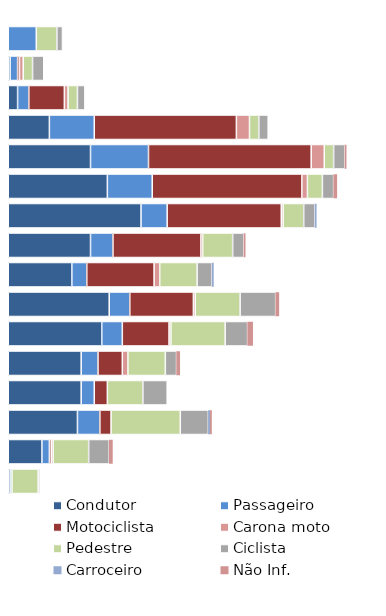
| Category | Condutor | Passageiro | Motociclista | Carona moto | Pedestre | Ciclista | Carroceiro | Não Inf. |
|---|---|---|---|---|---|---|---|---|
| 0-10 | 0 | 15 | 0 | 0 | 11 | 3 | 0 | 0 |
| 11-14 | 1 | 4 | 1 | 2 | 5 | 6 | 0 | 0 |
| 15-17 | 5 | 6 | 19 | 2 | 5 | 4 | 0 | 0 |
| 18-20 | 22 | 24 | 76 | 7 | 5 | 5 | 0 | 0 |
| 21-24 | 44 | 31 | 87 | 7 | 5 | 6 | 0 | 1 |
| 25-29 | 53 | 24 | 80 | 3 | 8 | 6 | 0 | 2 |
| 30-34 | 71 | 14 | 61 | 1 | 11 | 6 | 1 | 0 |
| 35-39 | 44 | 12 | 47 | 1 | 16 | 6 | 0 | 1 |
| 40-44 | 34 | 8 | 36 | 3 | 20 | 8 | 1 | 0 |
| 45-49 | 54 | 11 | 34 | 1 | 24 | 19 | 0 | 2 |
| 50-54 | 50 | 11 | 25 | 1 | 29 | 12 | 0 | 3 |
| 55-59 | 39 | 9 | 13 | 3 | 20 | 6 | 0 | 2 |
| 60-64 | 39 | 7 | 7 | 0 | 19 | 13 | 0 | 0 |
| 65-74 | 37 | 12 | 6 | 0 | 37 | 15 | 1 | 1 |
| 75+ | 18 | 4 | 1 | 1 | 19 | 11 | 0 | 2 |
| NI | 1 | 1 | 0 | 0 | 14 | 1 | 0 | 0 |